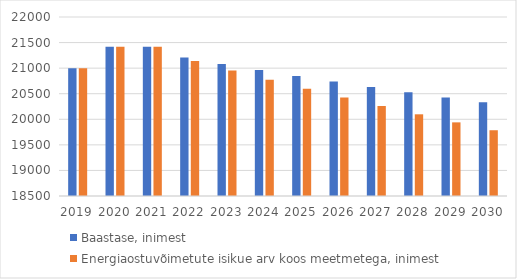
| Category | Baastase, inimest | Energiaostuvõimetute isikue arv koos meetmetega, inimest |
|---|---|---|
| 2019.0 | 21000 | 21000 |
| 2020.0 | 21420 | 21420 |
| 2021.0 | 21420 | 21420 |
| 2022.0 | 21205.8 | 21141.54 |
| 2023.0 | 21081.892 | 20954.583 |
| 2024.0 | 20963.412 | 20773.954 |
| 2025.0 | 20848.497 | 20597.756 |
| 2026.0 | 20737.422 | 20426.224 |
| 2027.0 | 20630.316 | 20259.446 |
| 2028.0 | 20527.169 | 20097.376 |
| 2029.0 | 20427.836 | 19939.83 |
| 2030.0 | 20331.276 | 19785.758 |